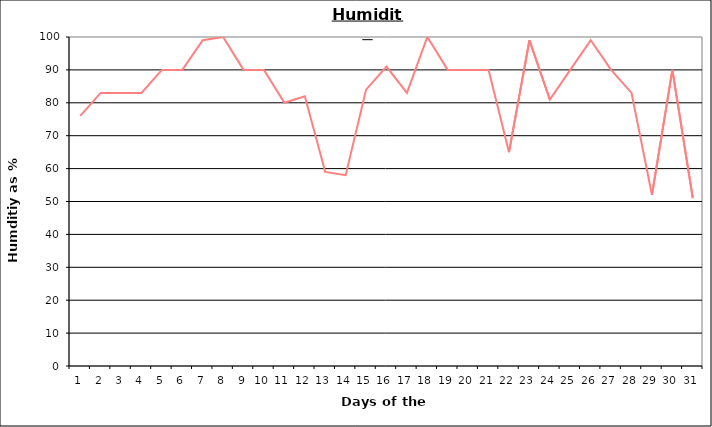
| Category | Series 0 |
|---|---|
| 0 | 76 |
| 1 | 83 |
| 2 | 83 |
| 3 | 83 |
| 4 | 90 |
| 5 | 90 |
| 6 | 99 |
| 7 | 100 |
| 8 | 90 |
| 9 | 90 |
| 10 | 80 |
| 11 | 82 |
| 12 | 59 |
| 13 | 58 |
| 14 | 84 |
| 15 | 91 |
| 16 | 83 |
| 17 | 100 |
| 18 | 90 |
| 19 | 90 |
| 20 | 90 |
| 21 | 65 |
| 22 | 99 |
| 23 | 81 |
| 24 | 90 |
| 25 | 99 |
| 26 | 90 |
| 27 | 83 |
| 28 | 52 |
| 29 | 90 |
| 30 | 51 |